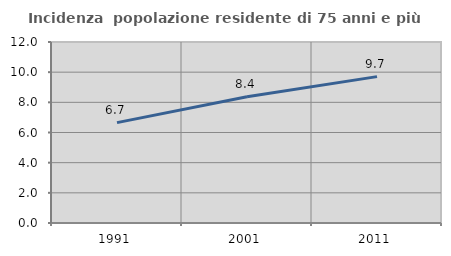
| Category | Incidenza  popolazione residente di 75 anni e più |
|---|---|
| 1991.0 | 6.656 |
| 2001.0 | 8.369 |
| 2011.0 | 9.705 |